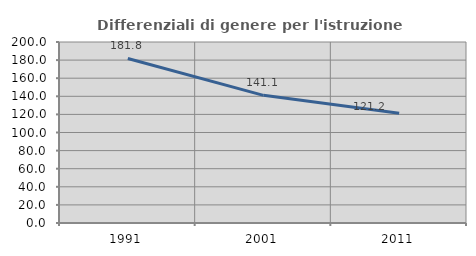
| Category | Differenziali di genere per l'istruzione superiore |
|---|---|
| 1991.0 | 181.818 |
| 2001.0 | 141.068 |
| 2011.0 | 121.177 |